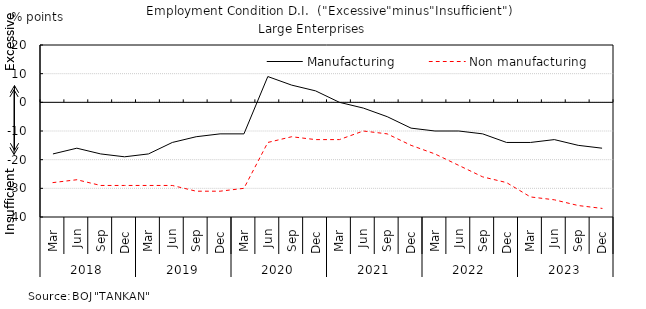
| Category | Manufacturing | Non manufacturing |
|---|---|---|
| 0 | -18 | -28 |
| 1 | -16 | -27 |
| 2 | -18 | -29 |
| 3 | -19 | -29 |
| 4 | -18 | -29 |
| 5 | -14 | -29 |
| 6 | -12 | -31 |
| 7 | -11 | -31 |
| 8 | -11 | -30 |
| 9 | 9 | -14 |
| 10 | 6 | -12 |
| 11 | 4 | -13 |
| 12 | 0 | -13 |
| 13 | -2 | -10 |
| 14 | -5 | -11 |
| 15 | -9 | -15 |
| 16 | -10 | -18 |
| 17 | -10 | -22 |
| 18 | -11 | -26 |
| 19 | -14 | -28 |
| 20 | -14 | -33 |
| 21 | -13 | -34 |
| 22 | -15 | -36 |
| 23 | -16 | -37 |